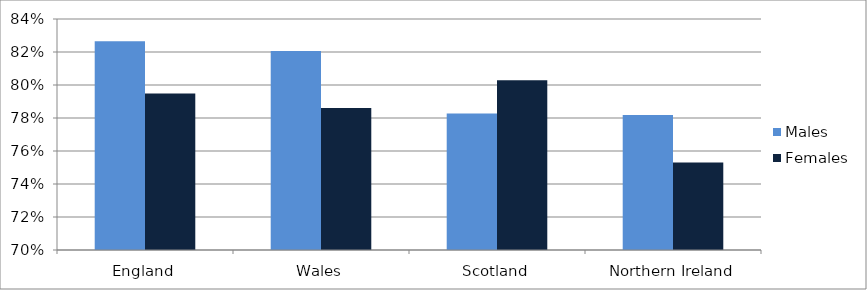
| Category | Males | Females |
|---|---|---|
| England | 0.827 | 0.795 |
| Wales | 0.821 | 0.786 |
| Scotland | 0.783 | 0.803 |
| Northern Ireland | 0.782 | 0.753 |